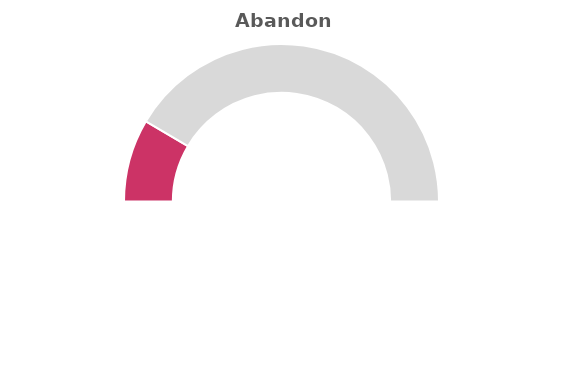
| Category | Series 0 |
|---|---|
| 0 | 0.17 |
| 1 | 0.83 |
| 2 | 1 |